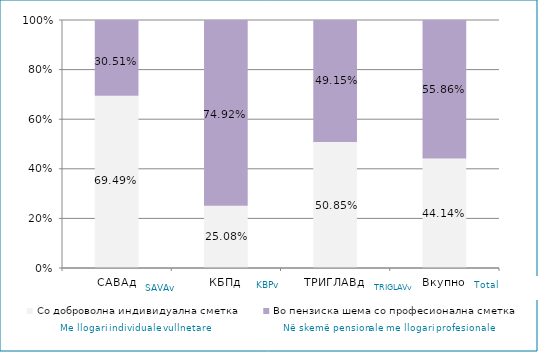
| Category | Со доброволна индивидуална сметка  | Во пензиска шема со професионална сметка |
|---|---|---|
| САВАд | 0.695 | 0.305 |
| КБПд | 0.251 | 0.749 |
| ТРИГЛАВд | 0.508 | 0.492 |
| Вкупно | 0.441 | 0.559 |